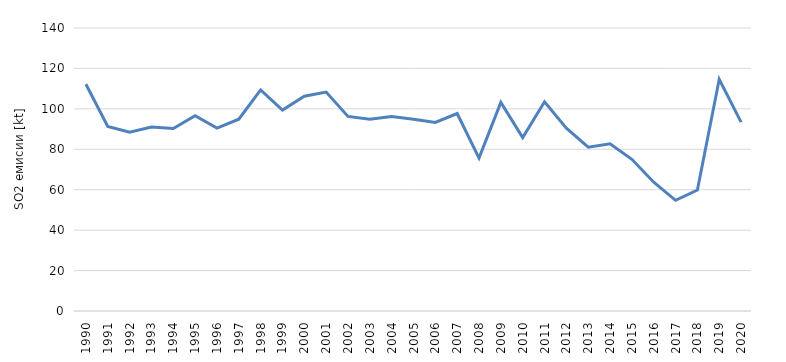
| Category | Series 0 |
|---|---|
| 1990.0 | 112.186 |
| 1991.0 | 91.28 |
| 1992.0 | 88.471 |
| 1993.0 | 90.981 |
| 1994.0 | 90.258 |
| 1995.0 | 96.627 |
| 1996.0 | 90.512 |
| 1997.0 | 94.852 |
| 1998.0 | 109.383 |
| 1999.0 | 99.368 |
| 2000.0 | 106.278 |
| 2001.0 | 108.329 |
| 2002.0 | 96.254 |
| 2003.0 | 94.885 |
| 2004.0 | 96.173 |
| 2005.0 | 94.907 |
| 2006.0 | 93.268 |
| 2007.0 | 97.709 |
| 2008.0 | 75.654 |
| 2009.0 | 103.183 |
| 2010.0 | 85.762 |
| 2011.0 | 103.519 |
| 2012.0 | 90.407 |
| 2013.0 | 81.043 |
| 2014.0 | 82.717 |
| 2015.0 | 75.033 |
| 2016.0 | 63.696 |
| 2017.0 | 54.758 |
| 2018.0 | 59.828 |
| 2019.0 | 114.655 |
| 2020.0 | 93.418 |